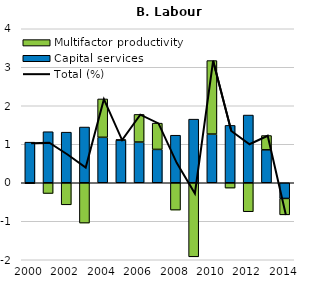
| Category | Capital services | Multifactor productivity |
|---|---|---|
| 2000.0 | 1.055 | -0.024 |
| 2001.0 | 1.326 | -0.279 |
| 2002.0 | 1.314 | -0.573 |
| 2003.0 | 1.447 | -1.047 |
| 2004.0 | 1.18 | 0.997 |
| 2005.0 | 1.109 | 0.007 |
| 2006.0 | 1.058 | 0.718 |
| 2007.0 | 0.866 | 0.682 |
| 2008.0 | 1.235 | -0.71 |
| 2009.0 | 1.652 | -1.924 |
| 2010.0 | 1.264 | 1.91 |
| 2011.0 | 1.49 | -0.139 |
| 2012.0 | 1.759 | -0.753 |
| 2013.0 | 0.855 | 0.371 |
| 2014.0 | -0.407 | -0.426 |